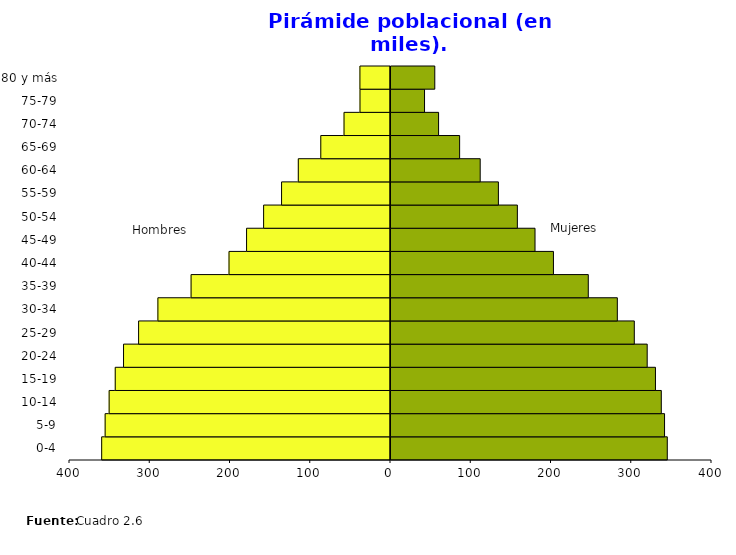
| Category | Hombres | Mujeres |
|---|---|---|
| 0-4 | -359.91 | 345.533 |
| 5-9 | -355.582 | 342.128 |
| 10-14 | -350.586 | 338.074 |
| 15-19 | -343.008 | 330.802 |
| 20-24 | -332.667 | 320.491 |
| 25-29 | -313.892 | 304.439 |
| 30-34 | -289.843 | 283.29 |
| 35-39 | -248.483 | 247.095 |
| 40-44 | -201.219 | 203.661 |
| 45-49 | -179.344 | 180.716 |
| 50-54 | -158.119 | 158.707 |
| 55-59 | -135.739 | 135.072 |
| 60-64 | -114.889 | 112.397 |
| 65-69 | -86.873 | 86.776 |
| 70-74 | -57.895 | 60.54 |
| 75-79 | -37.988 | 43.033 |
| 80 y más | -38.098 | 55.813 |